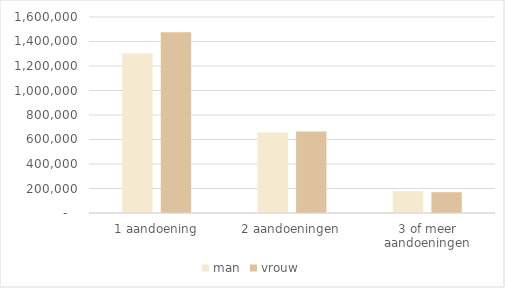
| Category | man | vrouw |
|---|---|---|
| 1 aandoening | 1301748 | 1474526 |
| 2 aandoeningen | 657574 | 666208 |
| 3 of meer aandoeningen | 177946 | 169854 |